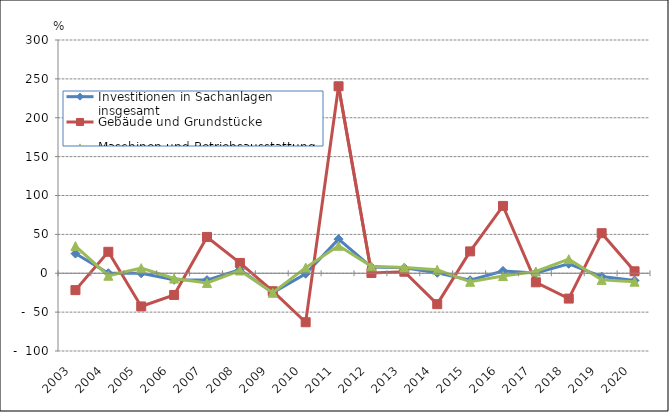
| Category | Investitionen in Sachanlagen insgesamt | Gebäude und Grundstücke | Maschinen und Betriebsausstattung |
|---|---|---|---|
| 2003.0 | 25.3 | -21.7 | 35 |
| 2004.0 | 0.1 | 27.6 | -3.2 |
| 2005.0 | -0.1 | -42.7 | 6.6 |
| 2006.0 | -8.473 | -27.938 | -6.81 |
| 2007.0 | -8.766 | 46.686 | -12.43 |
| 2008.0 | 4.511 | 13.27 | 3.542 |
| 2009.0 | -24.896 | -23.131 | -25.113 |
| 2010.0 | -0.603 | -63.012 | 7.236 |
| 2011.0 | 43.839 | 240.486 | 35.319 |
| 2012.0 | 8.013 | 0.373 | 8.846 |
| 2013.0 | 6.929 | 1.955 | 7.43 |
| 2014.0 | 0.591 | -39.758 | 4.441 |
| 2015.0 | -8.949 | 28.111 | -10.989 |
| 2016.0 | 2.982 | 86.615 | -3.643 |
| 2017.0 | 0.457 | -11.661 | 2.316 |
| 2018.0 | 12.174 | -32.584 | 18.102 |
| 2019.0 | -4.302 | 51.525 | -8.522 |
| 2020.0 | -9.369 | 2.522 | -10.858 |